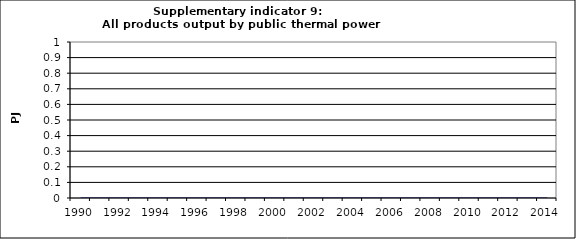
| Category | All products output by public thermal power stations, PJ |
|---|---|
| 1990 | 0 |
| 1991 | 0 |
| 1992 | 0 |
| 1993 | 0 |
| 1994 | 0 |
| 1995 | 0 |
| 1996 | 0 |
| 1997 | 0 |
| 1998 | 0 |
| 1999 | 0 |
| 2000 | 0 |
| 2001 | 0 |
| 2002 | 0 |
| 2003 | 0 |
| 2004 | 0 |
| 2005 | 0 |
| 2006 | 0 |
| 2007 | 0 |
| 2008 | 0 |
| 2009 | 0 |
| 2010 | 0 |
| 2011 | 0 |
| 2012 | 0 |
| 2013 | 0 |
| 2014 | 0 |